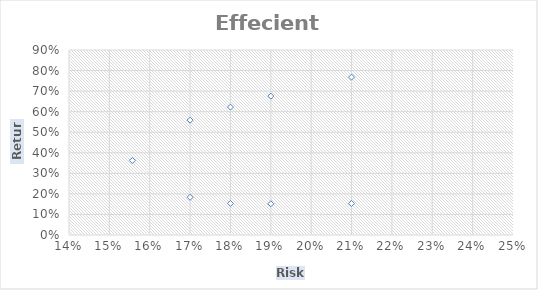
| Category | Risk |
|---|---|
| 0.1557 | 0.362 |
| 0.17 | 0.559 |
| 0.17 | 0.184 |
| 0.18 | 0.622 |
| 0.18 | 0.154 |
| 0.19 | 0.676 |
| 0.19 | 0.152 |
| 0.21 | 0.768 |
| 0.21 | 0.153 |